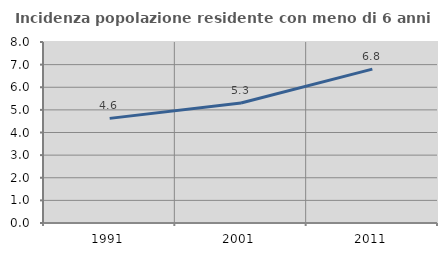
| Category | Incidenza popolazione residente con meno di 6 anni |
|---|---|
| 1991.0 | 4.625 |
| 2001.0 | 5.306 |
| 2011.0 | 6.801 |